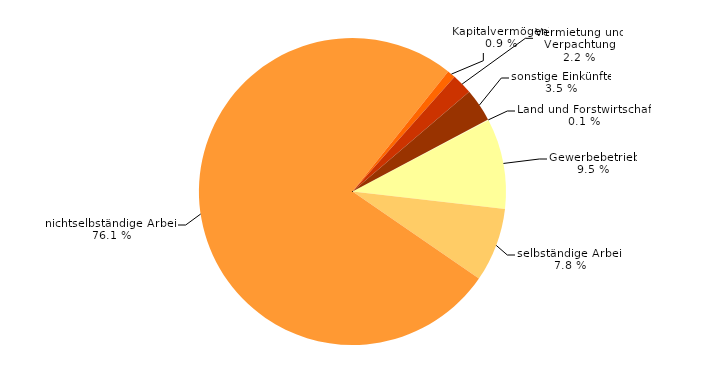
| Category | Series 0 |
|---|---|
| Land und Forstwirtschaft | 0.107 |
| Gewerbebetrieb | 9.492 |
| selbständige Arbeit | 7.777 |
| nichtselbständige Arbeit | 76.114 |
| Kapitalvermögen¹ | 0.862 |
| Vermietung und Verpachtung | 2.174 |
| sonstige Einkünfte | 3.474 |